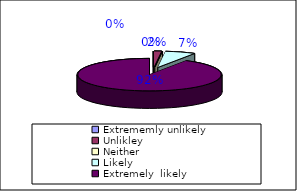
| Category | Would you recommend us to your friends and family |
|---|---|
| Extrememly unlikely | 0 |
| Unlikley | 1 |
| Neither | 0 |
| Likely | 4 |
| Extremely  likely  | 54 |